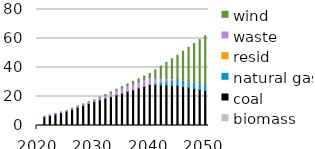
| Category | biomass | coal | natural gas | resid | waste | wind |
|---|---|---|---|---|---|---|
| 2020.0 | 0 | 0 | 0 | 0 | 0 | 0 |
| 2021.0 | 0.071 | 5.839 | 0 | 0 | 0.58 | 0 |
| 2022.0 | 0.082 | 6.799 | 0 | 0 | 0.597 | 0 |
| 2023.0 | 0.092 | 7.76 | 0 | 0 | 0.614 | 0 |
| 2024.0 | 0.103 | 8.72 | 0 | 0 | 0.632 | 0 |
| 2025.0 | 0.114 | 9.68 | 0 | 0 | 0.649 | 0 |
| 2026.0 | 0.13 | 11.004 | 0 | 0 | 0.73 | 0.031 |
| 2027.0 | 0.145 | 12.327 | 0 | 0 | 0.812 | 0.063 |
| 2028.0 | 0.161 | 13.651 | 0 | 0 | 0.893 | 0.094 |
| 2029.0 | 0.177 | 14.974 | 0 | 0 | 0.975 | 0.125 |
| 2030.0 | 0.193 | 16.298 | 0 | 0 | 1.056 | 0.157 |
| 2031.0 | 0.213 | 17.425 | -0.002 | 0 | 1.582 | 0.307 |
| 2032.0 | 0.233 | 18.553 | -0.005 | 0 | 2.109 | 0.457 |
| 2033.0 | 0.253 | 19.681 | -0.007 | 0 | 2.635 | 0.607 |
| 2034.0 | 0.272 | 20.808 | -0.009 | 0 | 3.161 | 0.757 |
| 2035.0 | 0.292 | 21.936 | -0.012 | 0 | 3.687 | 0.907 |
| 2036.0 | 0.312 | 23.112 | -0.009 | 0 | 3.918 | 1.296 |
| 2037.0 | 0.332 | 24.287 | -0.007 | 0 | 4.148 | 1.685 |
| 2038.0 | 0.352 | 25.463 | -0.005 | 0 | 4.379 | 2.074 |
| 2039.0 | 0.371 | 26.639 | -0.002 | 0 | 4.609 | 2.463 |
| 2040.0 | 0.391 | 27.815 | 0 | 0 | 4.84 | 2.852 |
| 2041.0 | 0.419 | 27.628 | 0.926 | 0 | 3.925 | 5.534 |
| 2042.0 | 0.447 | 27.442 | 1.852 | 0 | 3.01 | 8.216 |
| 2043.0 | 0.474 | 27.255 | 2.778 | 0 | 2.095 | 10.899 |
| 2044.0 | 0.502 | 27.068 | 3.705 | 0 | 1.18 | 13.581 |
| 2045.0 | 0.529 | 26.882 | 4.631 | 0 | 0.264 | 16.263 |
| 2046.0 | 0.559 | 26.189 | 4.632 | 0.031 | 0.245 | 19.588 |
| 2047.0 | 0.588 | 25.497 | 4.633 | 0.061 | 0.226 | 22.912 |
| 2048.0 | 0.617 | 24.804 | 4.633 | 0.092 | 0.207 | 26.237 |
| 2049.0 | 0.646 | 24.112 | 4.634 | 0.123 | 0.187 | 29.561 |
| 2050.0 | 0.675 | 23.419 | 4.635 | 0.153 | 0.168 | 32.885 |